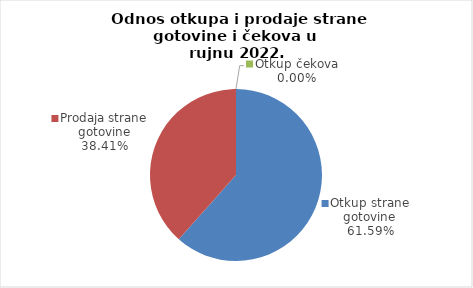
| Category | Series 0 |
|---|---|
| Otkup strane gotovine | 61.591 |
| Prodaja strane gotovine | 38.409 |
| Otkup čekova | 0 |